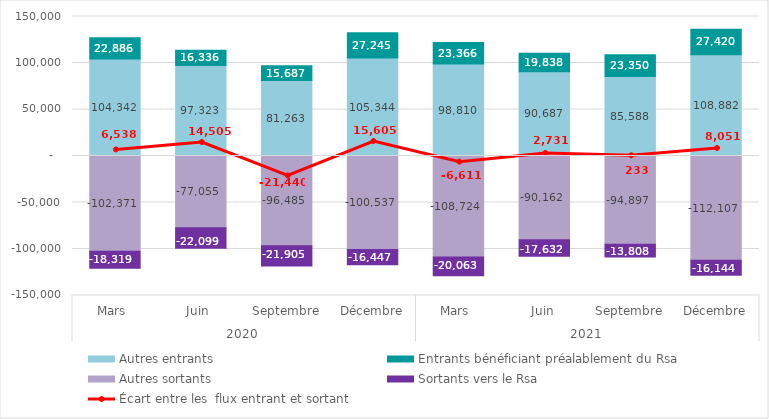
| Category |  Autres entrants  |  Entrants bénéficiant préalablement du Rsa  |  Autres sortants  |  Sortants vers le Rsa  |
|---|---|---|---|---|
| 0 | 104342 | 22886 | -102371 | -18319 |
| 1 | 97323 | 16336 | -77055 | -22099 |
| 2 | 81263 | 15687 | -96485 | -21905 |
| 3 | 105344 | 27245 | -100537 | -16447 |
| 4 | 98810 | 23366 | -108724 | -20063 |
| 5 | 90687 | 19838 | -90162 | -17632 |
| 6 | 85588 | 23350 | -94897 | -13808 |
| 7 | 108882 | 27420 | -112107 | -16144 |